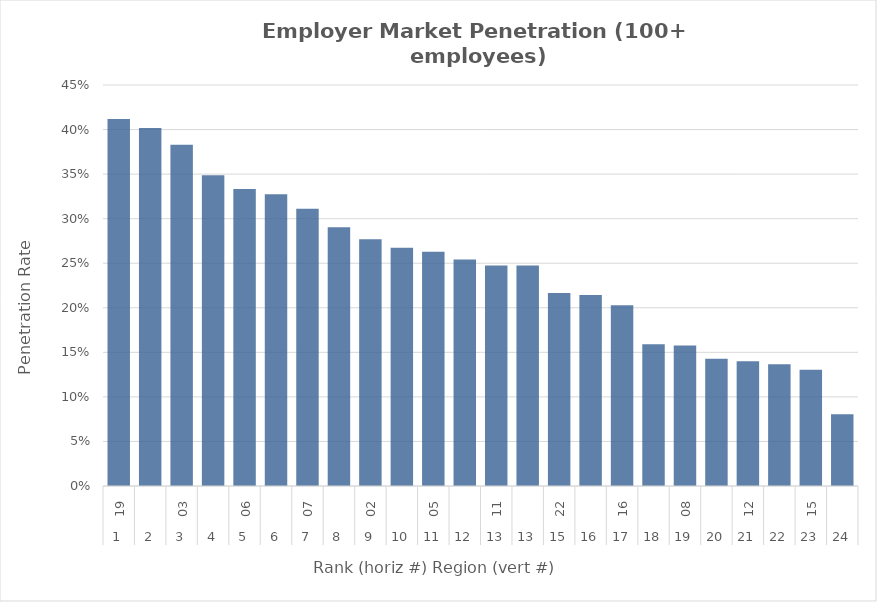
| Category | Rate |
|---|---|
| 0 | 0.412 |
| 1 | 0.402 |
| 2 | 0.383 |
| 3 | 0.349 |
| 4 | 0.333 |
| 5 | 0.327 |
| 6 | 0.311 |
| 7 | 0.29 |
| 8 | 0.277 |
| 9 | 0.267 |
| 10 | 0.263 |
| 11 | 0.254 |
| 12 | 0.247 |
| 13 | 0.247 |
| 14 | 0.217 |
| 15 | 0.214 |
| 16 | 0.203 |
| 17 | 0.159 |
| 18 | 0.158 |
| 19 | 0.143 |
| 20 | 0.14 |
| 21 | 0.137 |
| 22 | 0.13 |
| 23 | 0.081 |